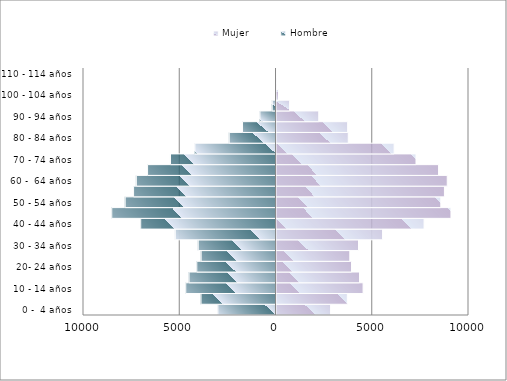
| Category | Hombre | Mujer |
|---|---|---|
| 0 -  4 años | -3020 | 2810 |
| 5 - 9 años | -3895 | 3679 |
| 10 - 14 años | -4688 | 4498 |
| 15 - 19 años | -4516 | 4313 |
| 20- 24 años | -4115 | 3897 |
| 25 - 29 años | -3888 | 3808 |
| 30 - 34 años | -4040 | 4260 |
| 35 - 39 años | -5233 | 5509 |
| 40 - 44 años | -7028 | 7666 |
| 45 - 49 años | -8532 | 9063 |
| 50 - 54 años | -7836 | 8535 |
| 55 - 59 años | -7399 | 8724 |
| 60 -  64 años | -7255 | 8870 |
| 65 - 69 años | -6672 | 8419 |
| 70 - 74 años | -5481 | 7246 |
| 75 - 79 años | -4215 | 6110 |
| 80 - 84 años | -2429 | 3728 |
| 85 -  89 años | -1739 | 3696 |
| 90 - 94 años | -836 | 2194 |
| 95 - 99 años | -196 | 680 |
| 100 - 104 años | -18 | 104 |
| 105 - 109 años | -3 | 12 |
| 110 - 114 años | -1 | 3 |